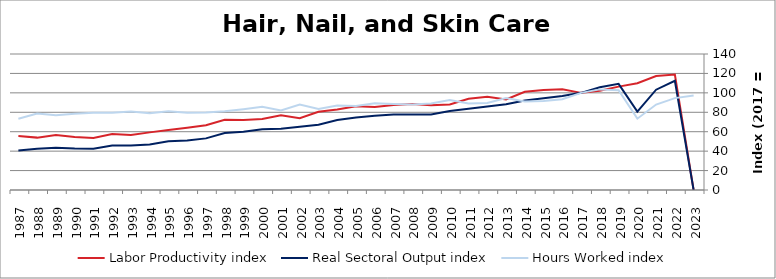
| Category | Labor Productivity index | Real Sectoral Output index | Hours Worked index |
|---|---|---|---|
| 2023.0 | 0 | 0 | 97.245 |
| 2022.0 | 118.905 | 112.463 | 94.582 |
| 2021.0 | 117.358 | 103.255 | 87.983 |
| 2020.0 | 109.834 | 80.643 | 73.422 |
| 2019.0 | 106.415 | 109.249 | 102.663 |
| 2018.0 | 102.163 | 105.813 | 103.573 |
| 2017.0 | 100 | 100 | 100 |
| 2016.0 | 103.76 | 96.878 | 93.368 |
| 2015.0 | 102.954 | 94.405 | 91.696 |
| 2014.0 | 101.182 | 92.104 | 91.028 |
| 2013.0 | 93.194 | 88.167 | 94.606 |
| 2012.0 | 96.083 | 86.015 | 89.521 |
| 2011.0 | 93.93 | 83.702 | 89.112 |
| 2010.0 | 88.001 | 81.409 | 92.509 |
| 2009.0 | 87.151 | 77.624 | 89.069 |
| 2008.0 | 88.456 | 77.759 | 87.907 |
| 2007.0 | 87.615 | 77.653 | 88.631 |
| 2006.0 | 85.397 | 76.359 | 89.416 |
| 2005.0 | 86.208 | 74.588 | 86.521 |
| 2004.0 | 82.758 | 72.026 | 87.032 |
| 2003.0 | 80.607 | 67.162 | 83.321 |
| 2002.0 | 73.997 | 65.14 | 88.03 |
| 2001.0 | 77.024 | 62.996 | 81.787 |
| 2000.0 | 72.984 | 62.451 | 85.568 |
| 1999.0 | 72.047 | 59.96 | 83.223 |
| 1998.0 | 72.317 | 58.571 | 80.992 |
| 1997.0 | 66.657 | 53.141 | 79.723 |
| 1996.0 | 64.053 | 50.914 | 79.488 |
| 1995.0 | 61.866 | 50.161 | 81.08 |
| 1994.0 | 59.324 | 46.922 | 79.094 |
| 1993.0 | 56.55 | 45.766 | 80.93 |
| 1992.0 | 57.69 | 45.849 | 79.475 |
| 1991.0 | 53.606 | 42.566 | 79.405 |
| 1990.0 | 54.44 | 42.737 | 78.503 |
| 1989.0 | 56.535 | 43.544 | 77.022 |
| 1988.0 | 53.921 | 42.496 | 78.811 |
| 1987.0 | 55.577 | 40.716 | 73.26 |